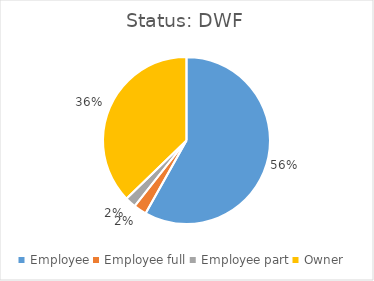
| Category | Status |
|---|---|
| Employee | 0.561 |
| Employee full | 0.024 |
| Employee part | 0.02 |
| Owner | 0.359 |